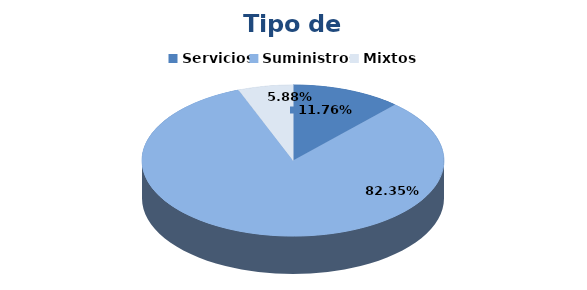
| Category | Series 0 |
|---|---|
| Servicios | 2 |
| Suministros | 14 |
| Mixtos | 1 |